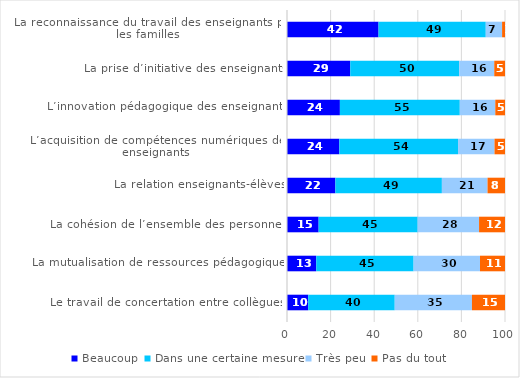
| Category | Beaucoup | Dans une certaine mesure | Très peu | Pas du tout |
|---|---|---|---|---|
| La reconnaissance du travail des enseignants par les familles | 41.994 | 49.185 | 7.491 | 1.329 |
| La prise d’initiative des enseignants | 29.014 | 49.981 | 16.077 | 4.928 |
| L’innovation pédagogique des enseignants | 24.262 | 55 | 16.287 | 5.009 |
| L’acquisition de compétences numériques des enseignants | 24.013 | 54.451 | 16.731 | 4.805 |
| La relation enseignants-élèves | 22.194 | 48.854 | 20.938 | 8.014 |
| La cohésion de l’ensemble des personnels | 14.511 | 45.423 | 28.172 | 11.894 |
| La mutualisation de ressources pédagogiques | 13.416 | 44.655 | 30.454 | 11.474 |
| Le travail de concertation entre collègues  | 9.756 | 39.662 | 35.415 | 15.167 |